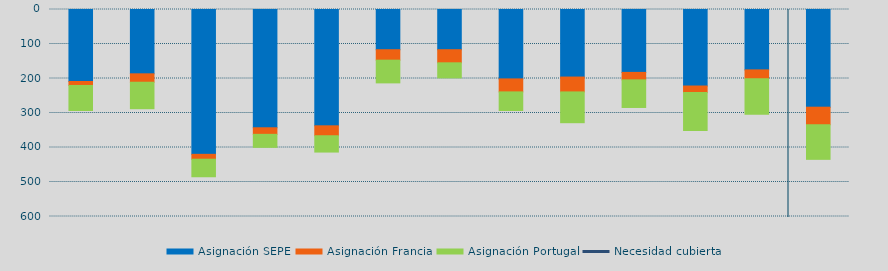
| Category | Asignación SEPE | Asignación Francia | Asignación Portugal |
|---|---|---|---|
| 0 | 208745.675 | 11423.2 | 72605.3 |
| 1 | 186451.1 | 24373.9 | 76706.4 |
| 2 | 419821.425 | 14091.1 | 50867.1 |
| 3 | 342830.4 | 19044.4 | 37683.7 |
| 4 | 337163.825 | 28792 | 47265.2 |
| 5 | 116549.7 | 30280 | 65872.4 |
| 6 | 116506.5 | 38015.1 | 43669.5 |
| 7 | 201179.9 | 37645.7 | 53874.9 |
| 8 | 195827.025 | 43063.3 | 89231.9 |
| 9 | 182309.325 | 21642.7 | 80020.9 |
| 10 | 221780.575 | 19149.1 | 109984.5 |
| 11 | 175030.425 | 25840.2 | 102588 |
| 12 | 283181.3 | 50841.7 | 100314.7 |